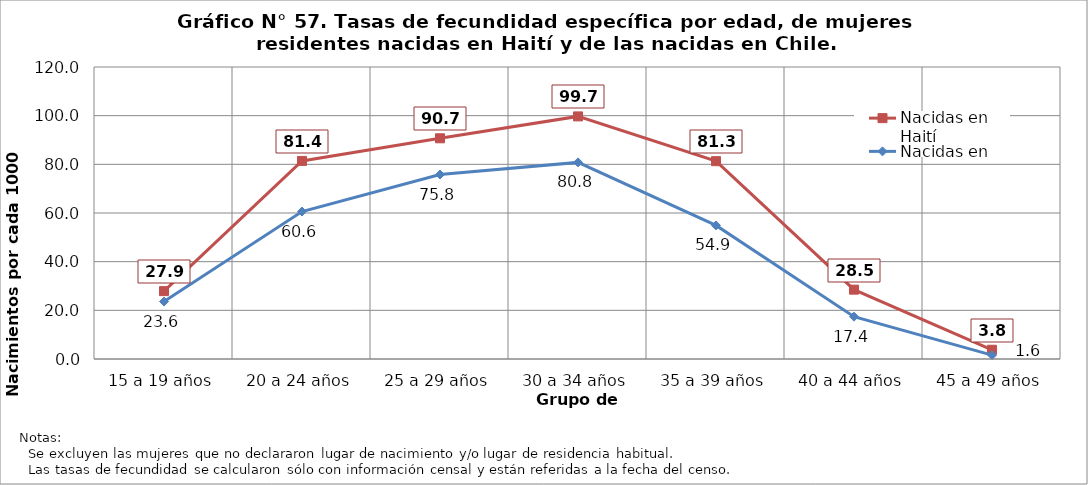
| Category | Nacidas en Haití | Nacidas en Chile |
|---|---|---|
| 15 a 19 años | 27.9 | 23.6 |
| 20 a 24 años | 81.4 | 60.6 |
| 25 a 29 años | 90.7 | 75.8 |
| 30 a 34 años | 99.7 | 80.8 |
| 35 a 39 años | 81.3 | 54.9 |
| 40 a 44 años | 28.5 | 17.4 |
| 45 a 49 años | 3.8 | 1.6 |